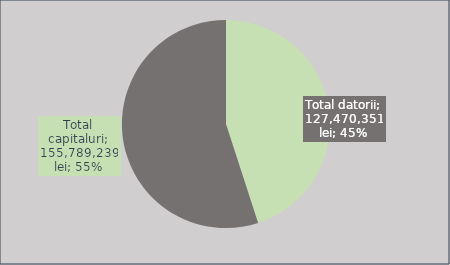
| Category | Series 0 |
|---|---|
| Total datorii | 127470351 |
| Total capitaluri | 155789238.578 |